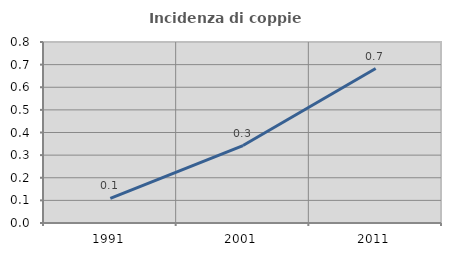
| Category | Incidenza di coppie miste |
|---|---|
| 1991.0 | 0.109 |
| 2001.0 | 0.342 |
| 2011.0 | 0.683 |